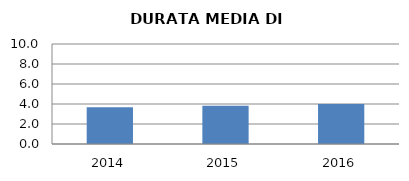
| Category | 2014 2015 2016 |
|---|---|
| 2014.0 | 3.667 |
| 2015.0 | 3.826 |
| 2016.0 | 4 |